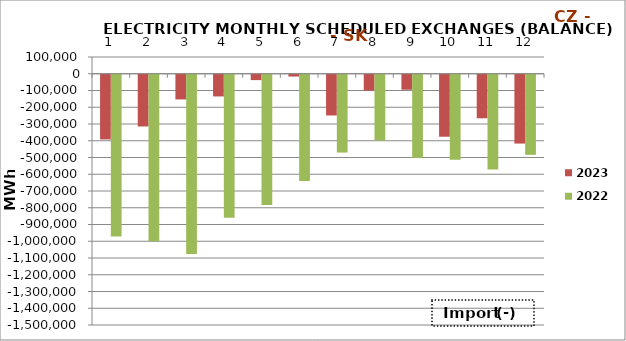
| Category | 2023 | 2022 |
|---|---|---|
| 0 | -386324.7 | -966359 |
| 1 | -308766.1 | -993646.5 |
| 2 | -147387.7 | -1069792.1 |
| 3 | -129446.5 | -854149.8 |
| 4 | -32010.3 | -778070.6 |
| 5 | -10652.4 | -634260.3 |
| 6 | -243010.4 | -464594.5 |
| 7 | -94879.3 | -393179.6 |
| 8 | -89468.2 | -496463.8 |
| 9 | -370007.5 | -507720.8 |
| 10 | -259810.2 | -565897.8 |
| 11 | -410898 | -478103.2 |